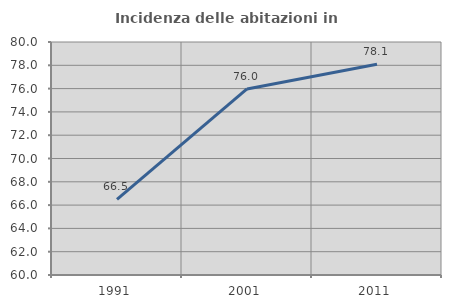
| Category | Incidenza delle abitazioni in proprietà  |
|---|---|
| 1991.0 | 66.494 |
| 2001.0 | 75.968 |
| 2011.0 | 78.095 |